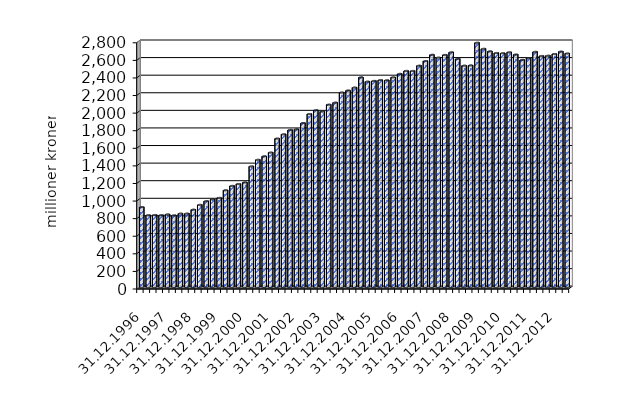
| Category | Series 0 |
|---|---|
| 31.12.1996 | 908.416 |
| 31.03.1997 | 816.888 |
| 30.06.1997 | 819.107 |
| 30.09.1997 | 817.552 |
| 31.12.1997 | 825.968 |
| 31.03.1998 | 814.897 |
| 30.06.1998 | 835.22 |
| 30.09.1998 | 835.281 |
| 31.12.1998 | 879.596 |
| 31.03.1999 | 934.62 |
| 30.06.1999 | 976.412 |
| 30.09.1999 | 997.754 |
| 31.12.1999 | 1013.598 |
| 31.03.2000 | 1100.701 |
| 30.06.2000 | 1150.3 |
| 30.09.2000 | 1172.025 |
| 31.12.2000 | 1189.651 |
| 31.03.2001 | 1372.393 |
| 30.06.2001 | 1446.885 |
| 30.09.2001 | 1486.566 |
| 31.12.2001 | 1529.197 |
| 31.03.2002 | 1688.425 |
| 30.06.2002 | 1737.205 |
| 30.09.2002 | 1786.525 |
| 31.12.2002 | 1793.289 |
| 31.03.2003 | 1864.766 |
| 30.06.2003 | 1967.535 |
| 30.09.2003 | 2010.838 |
| 31.12.2003 | 1995.419 |
| 31.03.2004 | 2074.018 |
| 30.06.2004 | 2097.095 |
| 30.09.2004 | 2212.138 |
| 31.12.2004 | 2235.082 |
| 31.03.2005 | 2268.67 |
| 30.06.2005 | 2384.125 |
| 30.09.2005 | 2335.849 |
| 31.12.2005 | 2343.776 |
| 31.03.2006 | 2353.286 |
| 30.06.2006 | 2351.281 |
| 30.09.2006 | 2384.618 |
| 31.12.2006 | 2424.277 |
| 31.03.2007 | 2457.666 |
| 30.06.2007 | 2457.37 |
| 30.09.2007 | 2517.064 |
| 31.12.2007 | 2569.962 |
| 31.03.2008 | 2640.759 |
| 30.06.2008 | 2609.016 |
| 30.09.2008 | 2639.404 |
| 31.12.2008 | 2669.518 |
| 31.03.2009 | 2594.419 |
| 30.06.2009 | 2517.3 |
| 30.09.2009 | 2520.265 |
| 31.12.2009 | 2778.162 |
| 31.03.2010 | 2708.956 |
| 30.06.2010 | 2680.032 |
| 30.09.2010 | 2661.718 |
| 31.12.2010 | 2658.994 |
| 31.03.2011 | 2670.097 |
| 30.06.2011 | 2643.777 |
| 30.09.2011 | 2582.864 |
| 31.12.2011 | 2603.653 |
| 31.03.2012 | 2674.662 |
| 30.06.2012 | 2627.864 |
| 30.09.2012 | 2630.833 |
| 31.12.2012 | 2649.814 |
| 31.03.2013 | 2676.984 |
| 30.06.2013 | 2656.134 |